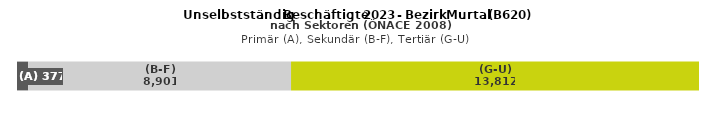
| Category | (A) | (B-F) | (G-U) |
|---|---|---|---|
| 0 | 377 | 8901 | 13812 |